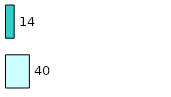
| Category | Series 0 | Series 1 |
|---|---|---|
| 0 | 40 | 14 |